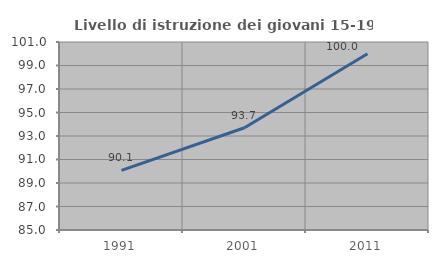
| Category | Livello di istruzione dei giovani 15-19 anni |
|---|---|
| 1991.0 | 90.071 |
| 2001.0 | 93.701 |
| 2011.0 | 100 |